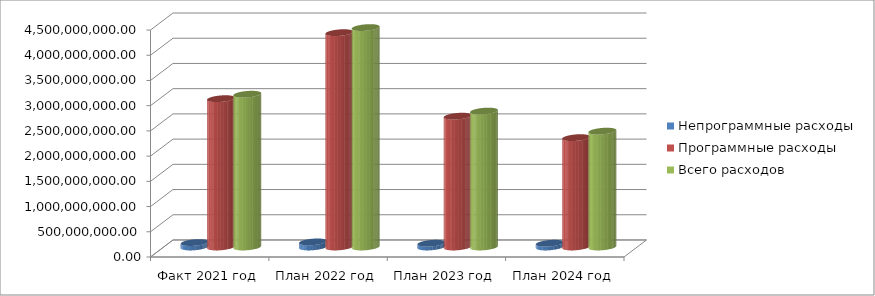
| Category | Непрограммные расходы | Программные расходы | Всего расходов |
|---|---|---|---|
| Факт 2021 год | 88271042.59 | 2940800625.65 | 3029071668.24 |
| План 2022 год | 101183304.49 | 4249306077.13 | 4350489381.62 |
| План 2023 год | 74905639 | 2593865264.93 | 2694770903.93 |
| План 2024 год | 74924210 | 2168267883.59 | 2296792093.59 |